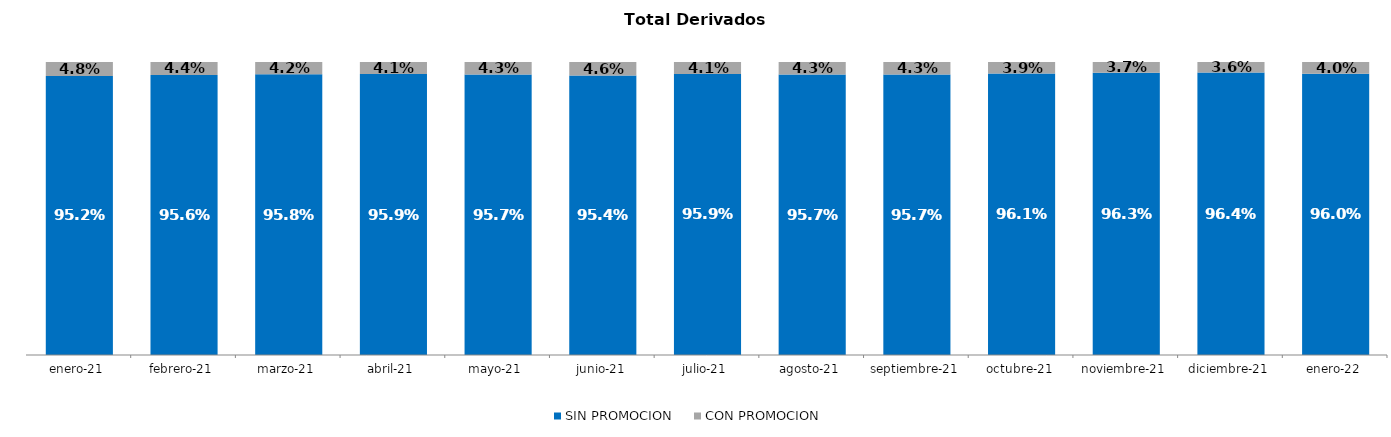
| Category | SIN PROMOCION   | CON PROMOCION   |
|---|---|---|
| 2021-01-01 | 0.952 | 0.048 |
| 2021-02-01 | 0.956 | 0.044 |
| 2021-03-01 | 0.958 | 0.042 |
| 2021-04-01 | 0.959 | 0.041 |
| 2021-05-01 | 0.957 | 0.043 |
| 2021-06-01 | 0.954 | 0.046 |
| 2021-07-01 | 0.959 | 0.041 |
| 2021-08-01 | 0.957 | 0.043 |
| 2021-09-01 | 0.957 | 0.043 |
| 2021-10-01 | 0.961 | 0.039 |
| 2021-11-01 | 0.963 | 0.037 |
| 2021-12-01 | 0.964 | 0.036 |
| 2022-01-01 | 0.96 | 0.04 |